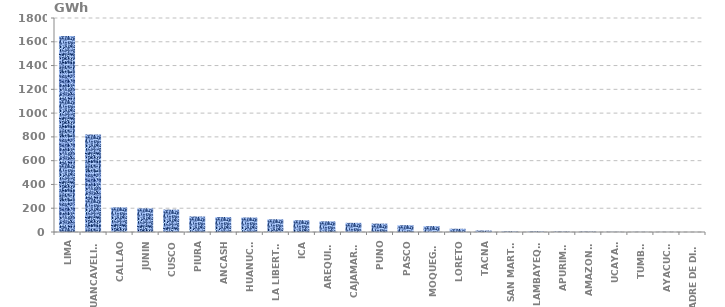
| Category | Series 0 |
|---|---|
| LIMA | 1648.526 |
| HUANCAVELICA | 820.053 |
| CALLAO | 207.075 |
| JUNIN | 198.803 |
| CUSCO | 188.304 |
| PIURA | 130.36 |
| ANCASH | 125.799 |
| HUANUCO | 121.987 |
| LA LIBERTAD | 107.1 |
| ICA | 99.17 |
| AREQUIPA | 89.823 |
| CAJAMARCA | 77.012 |
| PUNO | 70.66 |
| PASCO | 57.322 |
| MOQUEGUA | 49.485 |
| LORETO | 27.365 |
| TACNA | 12.513 |
| SAN MARTÍN | 4.867 |
| LAMBAYEQUE | 4.628 |
| APURIMAC | 3.423 |
| AMAZONAS | 3.162 |
| UCAYALI | 1.424 |
| TUMBES | 1.101 |
| AYACUCHO | 0.893 |
| MADRE DE DIOS | 0.119 |